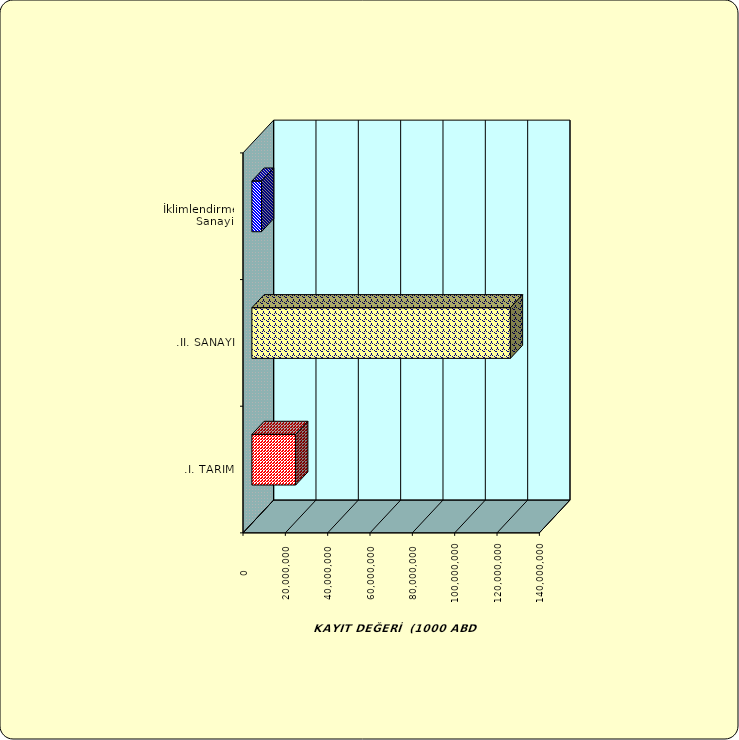
| Category | Series 0 |
|---|---|
| .I. TARIM | 20687213.036 |
| .II. SANAYİ | 122115374.269 |
|  İklimlendirme Sanayii | 4551940.978 |